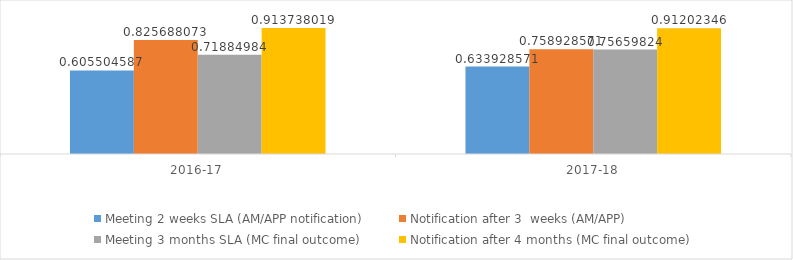
| Category | Meeting 2 weeks SLA (AM/APP notification) | Notification after 3  weeks (AM/APP) | Meeting 3 months SLA (MC final outcome) | Notification after 4 months (MC final outcome)  |
|---|---|---|---|---|
| 2016-17 | 0.606 | 0.826 | 0.719 | 0.914 |
| 2017-18 | 0.634 | 0.759 | 0.757 | 0.912 |